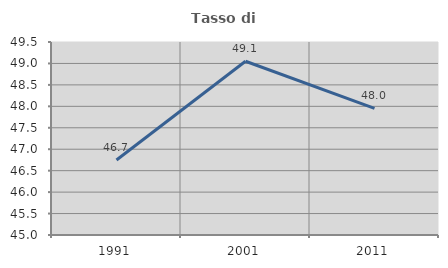
| Category | Tasso di occupazione   |
|---|---|
| 1991.0 | 46.748 |
| 2001.0 | 49.052 |
| 2011.0 | 47.951 |